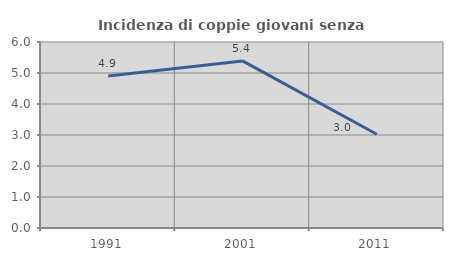
| Category | Incidenza di coppie giovani senza figli |
|---|---|
| 1991.0 | 4.903 |
| 2001.0 | 5.39 |
| 2011.0 | 3.023 |